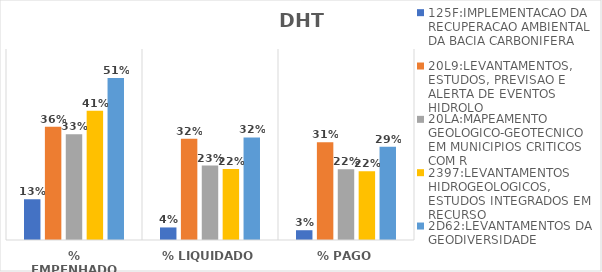
| Category | 125F:IMPLEMENTACAO DA RECUPERACAO AMBIENTAL DA BACIA CARBONIFERA | 20L9:LEVANTAMENTOS, ESTUDOS, PREVISAO E ALERTA DE EVENTOS HIDROLO | 20LA:MAPEAMENTO GEOLOGICO-GEOTECNICO EM MUNICIPIOS CRITICOS COM R | 2397:LEVANTAMENTOS HIDROGEOLOGICOS, ESTUDOS INTEGRADOS EM RECURSO | 2D62:LEVANTAMENTOS DA GEODIVERSIDADE |
|---|---|---|---|---|---|
| % EMPENHADO | 0.128 | 0.356 | 0.332 | 0.406 | 0.509 |
| % LIQUIDADO | 0.039 | 0.318 | 0.234 | 0.223 | 0.322 |
| % PAGO | 0.031 | 0.307 | 0.222 | 0.216 | 0.293 |